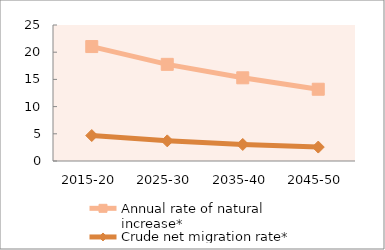
| Category | Annual rate of natural increase* | Crude net migration rate* |
|---|---|---|
| 2015-20 | 21.037 | 4.682 |
| 2025-30 | 17.767 | 3.701 |
| 2035-40 | 15.294 | 3.036 |
| 2045-50 | 13.19 | 2.561 |